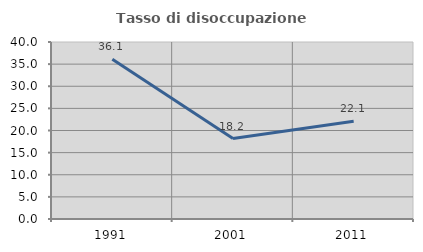
| Category | Tasso di disoccupazione giovanile  |
|---|---|
| 1991.0 | 36.076 |
| 2001.0 | 18.182 |
| 2011.0 | 22.078 |